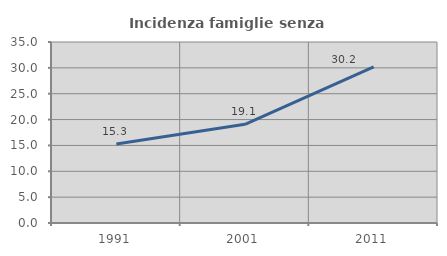
| Category | Incidenza famiglie senza nuclei |
|---|---|
| 1991.0 | 15.262 |
| 2001.0 | 19.079 |
| 2011.0 | 30.178 |